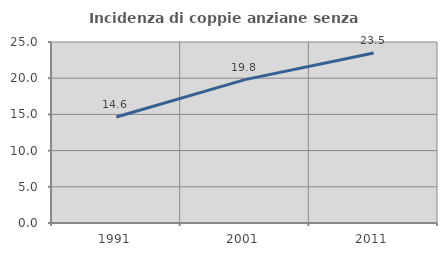
| Category | Incidenza di coppie anziane senza figli  |
|---|---|
| 1991.0 | 14.646 |
| 2001.0 | 19.807 |
| 2011.0 | 23.469 |